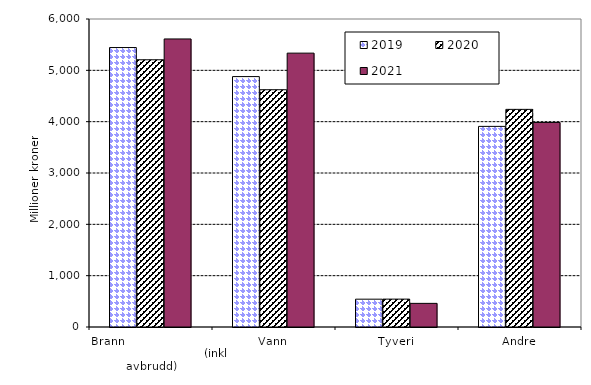
| Category | 2019 | 2020 | 2021 |
|---|---|---|---|
| Brann                                                       (inkl avbrudd) | 5443.964 | 5205.622 | 5611.316 |
| Vann | 4878.204 | 4622.244 | 5335.101 |
| Tyveri | 541.962 | 543.275 | 460.479 |
| Andre | 3908.174 | 4239.75 | 3984.789 |